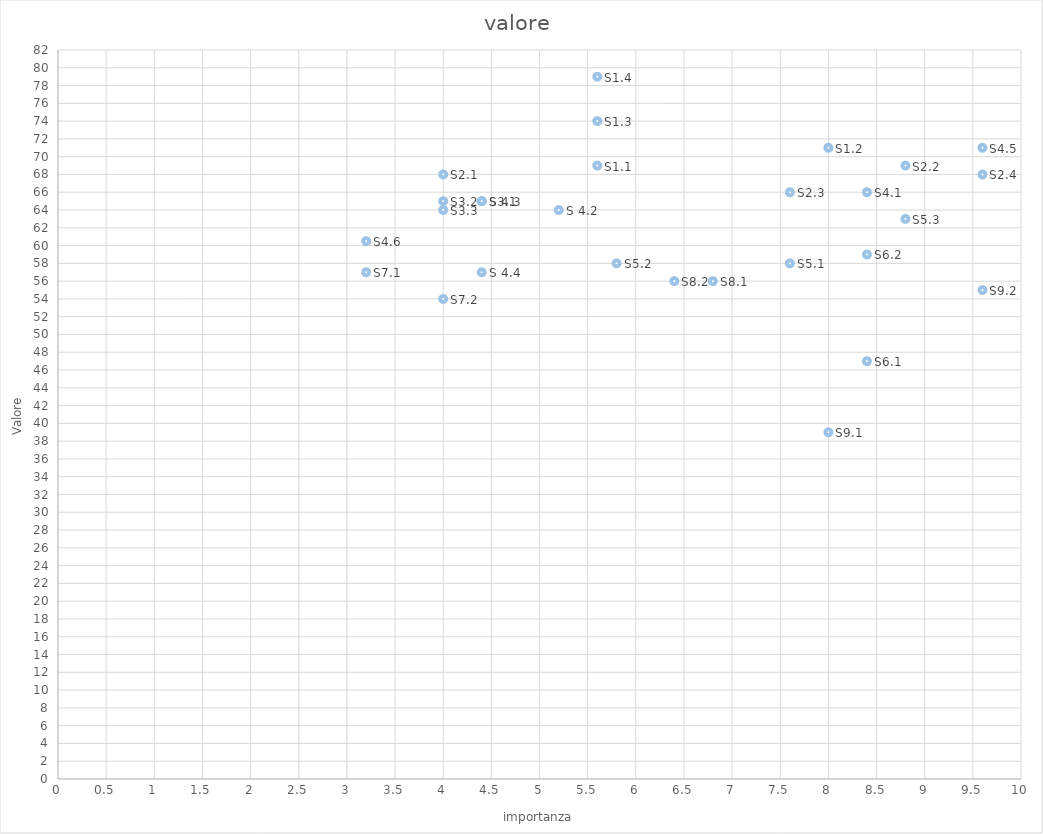
| Category | valore |
|---|---|
| 5.6 | 69 |
| 8.0 | 71 |
| 5.6 | 74 |
| 5.6 | 79 |
| 4.0 | 68 |
| 8.8 | 69 |
| 7.6 | 66 |
| 9.6 | 68 |
| 4.4 | 65 |
| 4.0 | 65 |
| 4.0 | 64 |
| 8.4 | 66 |
| 5.2 | 64 |
| 4.4 | 65 |
| 4.4 | 57 |
| 9.6 | 71 |
| 3.2 | 60.5 |
| 7.6 | 58 |
| 5.8 | 58 |
| 8.8 | 63 |
| 8.4 | 47 |
| 8.4 | 59 |
| 3.2 | 57 |
| 4.0 | 54 |
| 6.8 | 56 |
| 6.4 | 56 |
| 8.0 | 39 |
| 9.6 | 55 |